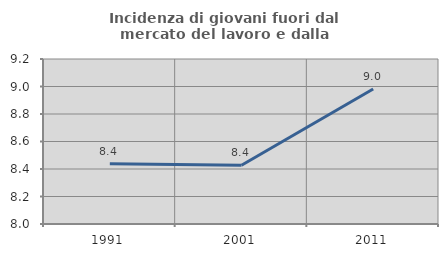
| Category | Incidenza di giovani fuori dal mercato del lavoro e dalla formazione  |
|---|---|
| 1991.0 | 8.439 |
| 2001.0 | 8.427 |
| 2011.0 | 8.982 |